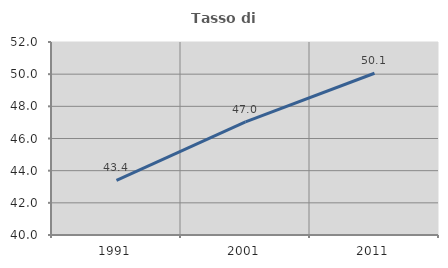
| Category | Tasso di occupazione   |
|---|---|
| 1991.0 | 43.402 |
| 2001.0 | 47.032 |
| 2011.0 | 50.056 |